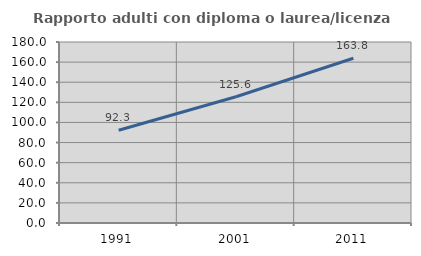
| Category | Rapporto adulti con diploma o laurea/licenza media  |
|---|---|
| 1991.0 | 92.258 |
| 2001.0 | 125.602 |
| 2011.0 | 163.831 |